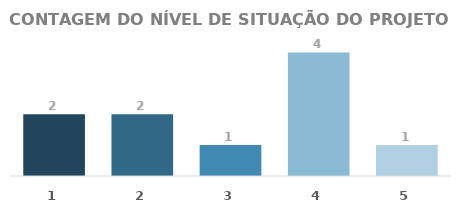
| Category | QTD. |
|---|---|
| 1.0 | 2 |
| 2.0 | 2 |
| 3.0 | 1 |
| 4.0 | 4 |
| 5.0 | 1 |